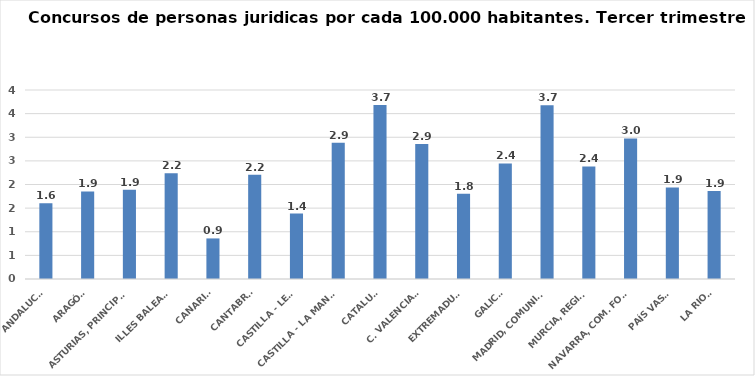
| Category | Series 0 |
|---|---|
| ANDALUCÍA | 1.601 |
| ARAGÓN | 1.853 |
| ASTURIAS, PRINCIPADO | 1.888 |
| ILLES BALEARS | 2.237 |
| CANARIAS | 0.859 |
| CANTABRIA | 2.209 |
| CASTILLA - LEÓN | 1.385 |
| CASTILLA - LA MANCHA | 2.884 |
| CATALUÑA | 3.684 |
| C. VALENCIANA | 2.855 |
| EXTREMADURA | 1.802 |
| GALICIA | 2.445 |
| MADRID, COMUNIDAD | 3.679 |
| MURCIA, REGIÓN | 2.383 |
| NAVARRA, COM. FORAL | 2.975 |
| PAÍS VASCO | 1.937 |
| LA RIOJA | 1.862 |